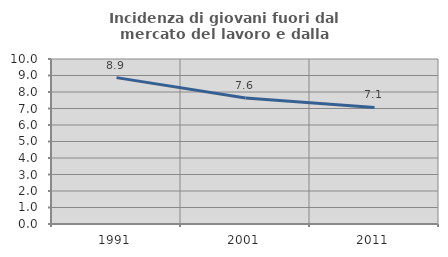
| Category | Incidenza di giovani fuori dal mercato del lavoro e dalla formazione  |
|---|---|
| 1991.0 | 8.871 |
| 2001.0 | 7.635 |
| 2011.0 | 7.062 |